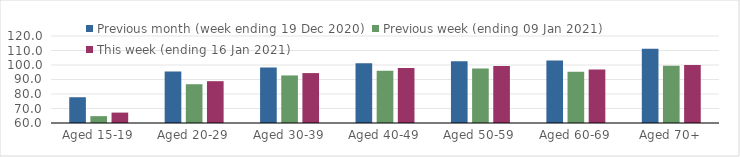
| Category | Previous month (week ending 19 Dec 2020) | Previous week (ending 09 Jan 2021) | This week (ending 16 Jan 2021) |
|---|---|---|---|
| Aged 15-19 | 77.77 | 64.73 | 67.17 |
| Aged 20-29 | 95.49 | 86.74 | 88.84 |
| Aged 30-39 | 98.29 | 92.79 | 94.42 |
| Aged 40-49 | 101.22 | 96.05 | 97.92 |
| Aged 50-59 | 102.64 | 97.54 | 99.36 |
| Aged 60-69 | 103.11 | 95.36 | 96.92 |
| Aged 70+ | 111.29 | 99.51 | 100.07 |